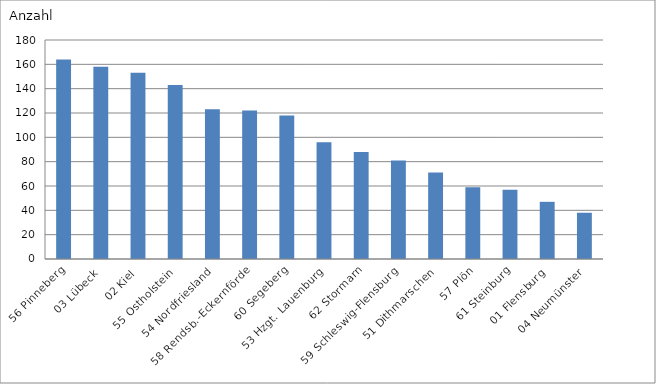
| Category | 56 Pinneberg |
|---|---|
| 56 Pinneberg | 164 |
| 03 Lübeck | 158 |
| 02 Kiel | 153 |
| 55 Ostholstein | 143 |
| 54 Nordfriesland | 123 |
| 58 Rendsb.-Eckernförde | 122 |
| 60 Segeberg | 118 |
| 53 Hzgt. Lauenburg | 96 |
| 62 Stormarn | 88 |
| 59 Schleswig-Flensburg | 81 |
| 51 Dithmarschen | 71 |
| 57 Plön | 59 |
| 61 Steinburg | 57 |
| 01 Flensburg | 47 |
| 04 Neumünster | 38 |